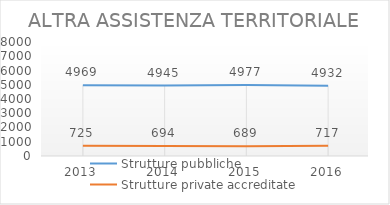
| Category | Strutture pubbliche | Strutture private accreditate |
|---|---|---|
| 2013.0 | 4969 | 725 |
| 2014.0 | 4945 | 694 |
| 2015.0 | 4977 | 689 |
| 2016.0 | 4932 | 717 |